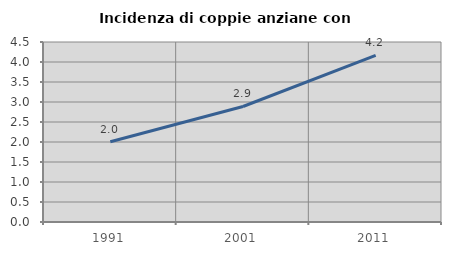
| Category | Incidenza di coppie anziane con figli |
|---|---|
| 1991.0 | 2.007 |
| 2001.0 | 2.888 |
| 2011.0 | 4.167 |